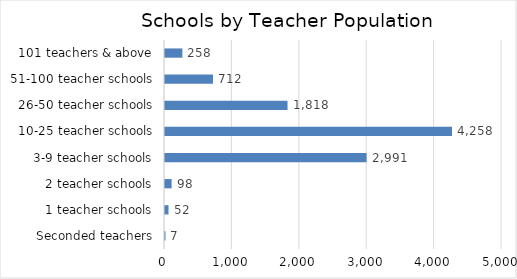
| Category | Series 0 |
|---|---|
| Seconded teachers | 7 |
| 1 teacher schools | 52 |
| 2 teacher schools | 98 |
| 3-9 teacher schools | 2991 |
| 10-25 teacher schools | 4258 |
| 26-50 teacher schools | 1818 |
| 51-100 teacher schools | 712 |
| 101 teachers & above | 258 |